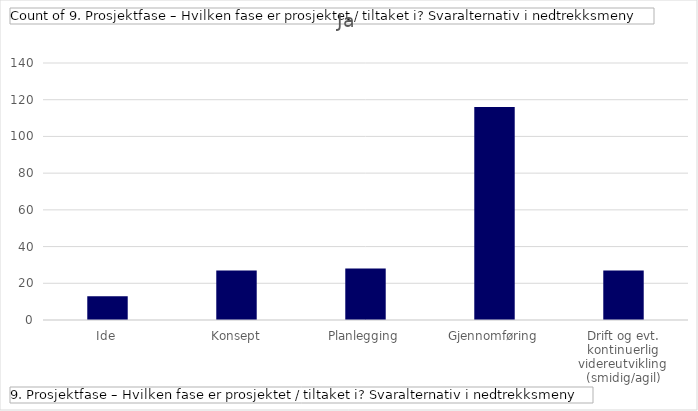
| Category | Ja |
|---|---|
| Ide | 13 |
| Konsept | 27 |
| Planlegging | 28 |
| Gjennomføring | 116 |
| Drift og evt. kontinuerlig videreutvikling (smidig/agil) | 27 |